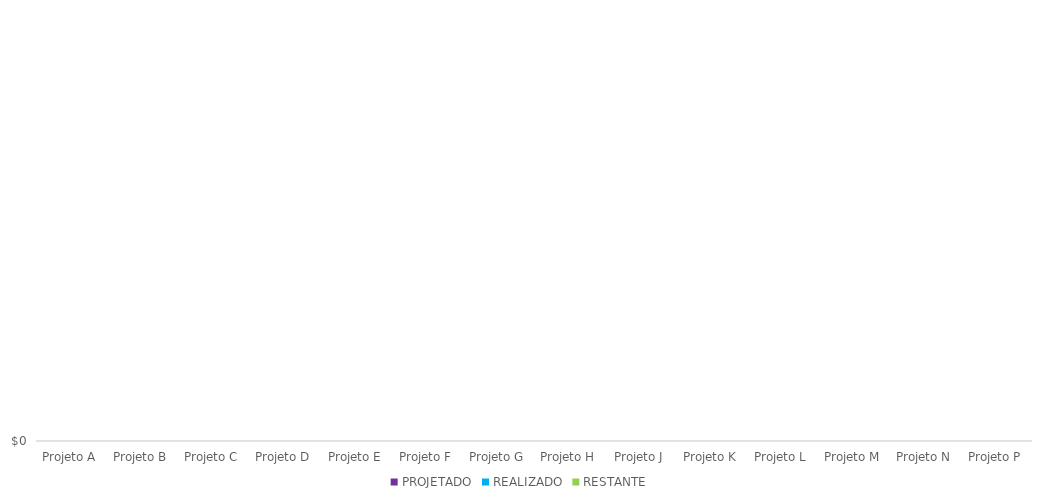
| Category | PROJETADO | REALIZADO | RESTANTE |
|---|---|---|---|
| Projeto A |  |  | 0 |
| Projeto B |  |  | 0 |
| Projeto C |  |  | 0 |
| Projeto D |  |  | 0 |
| Projeto E |  |  | 0 |
| Projeto F |  |  | 0 |
| Projeto G |  |  | 0 |
| Projeto H |  |  | 0 |
| Projeto J |  |  | 0 |
| Projeto K |  |  | 0 |
| Projeto L |  |  | 0 |
| Projeto M |  |  | 0 |
| Projeto N |  |  | 0 |
| Projeto P |  |  | 0 |